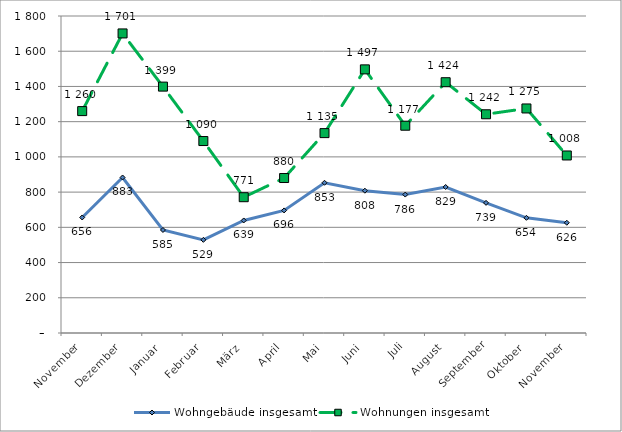
| Category | Wohngebäude insgesamt | Wohnungen insgesamt |
|---|---|---|
| November | 656 | 1260 |
| Dezember | 883 | 1701 |
| Januar | 585 | 1399 |
| Februar | 529 | 1090 |
| März | 639 | 771 |
| April | 696 | 880 |
| Mai | 853 | 1135 |
| Juni | 808 | 1497 |
| Juli | 786 | 1177 |
| August | 829 | 1424 |
| September | 739 | 1242 |
| Oktober | 654 | 1275 |
| November | 626 | 1008 |